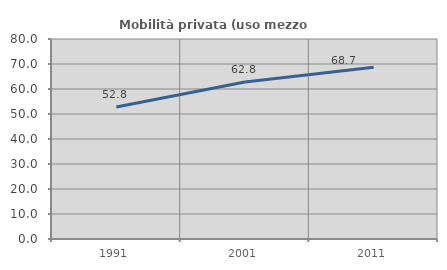
| Category | Mobilità privata (uso mezzo privato) |
|---|---|
| 1991.0 | 52.788 |
| 2001.0 | 62.8 |
| 2011.0 | 68.666 |